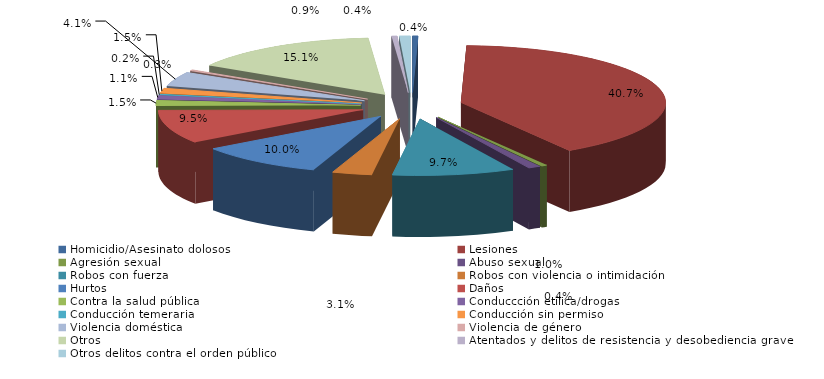
| Category | Series 0 |
|---|---|
| Homicidio/Asesinato dolosos | 4 |
| Lesiones | 375 |
| Agresión sexual | 4 |
| Abuso sexual | 9 |
| Robos con fuerza | 89 |
| Robos con violencia o intimidación | 29 |
| Hurtos | 92 |
| Daños | 88 |
| Contra la salud pública | 14 |
| Conduccción etílica/drogas | 10 |
| Conducción temeraria | 2 |
| Conducción sin permiso | 14 |
| Violencia doméstica | 38 |
| Violencia de género | 3 |
| Otros | 139 |
| Atentados y delitos de resistencia y desobediencia grave | 4 |
| Otros delitos contra el orden público | 8 |